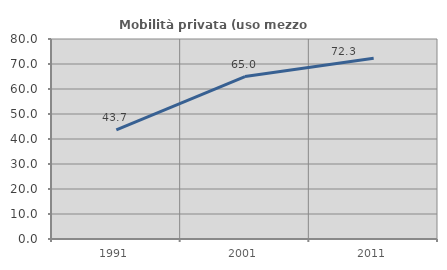
| Category | Mobilità privata (uso mezzo privato) |
|---|---|
| 1991.0 | 43.67 |
| 2001.0 | 64.988 |
| 2011.0 | 72.274 |